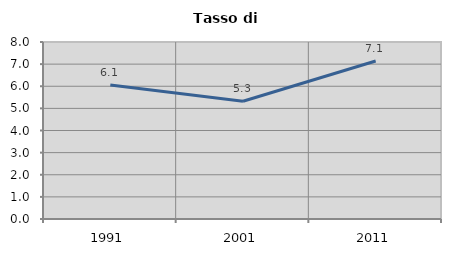
| Category | Tasso di disoccupazione   |
|---|---|
| 1991.0 | 6.061 |
| 2001.0 | 5.322 |
| 2011.0 | 7.143 |